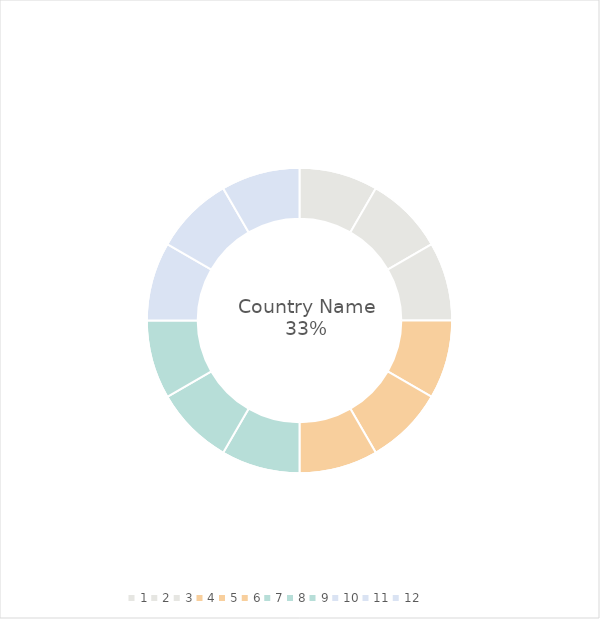
| Category | Series 0 | Series 1 | Series 2 |
|---|---|---|---|
| 0 | 1 | 1 | 1 |
| 1 | 1 | 1 | 1 |
| 2 | 1 | 1 | 1 |
| 3 | 1 | 1 | 1 |
| 4 | 1 | 1 | 1 |
| 5 | 1 | 1 | 1 |
| 6 | 1 | 1 | 1 |
| 7 | 1 | 1 | 1 |
| 8 | 1 | 1 | 1 |
| 9 | 1 | 1 | 1 |
| 10 | 1 | 1 | 1 |
| 11 | 1 | 1 | 1 |